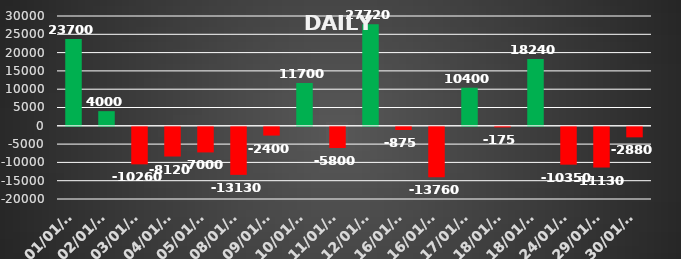
| Category | Series 0 |
|---|---|
| 2024-01-01 | 23700 |
| 2024-01-02 | 4000 |
| 2024-01-03 | -10260 |
| 2024-01-04 | -8120 |
| 2024-01-05 | -7000 |
| 2024-01-08 | -13130 |
| 2024-01-09 | -2400 |
| 2024-01-10 | 11700 |
| 2024-01-11 | -5800 |
| 2024-01-12 | 27720 |
| 2024-01-16 | -875 |
| 2024-01-16 | -13760 |
| 2024-01-17 | 10400 |
| 2024-01-18 | -175 |
| 2024-01-18 | 18240 |
| 2024-01-24 | -10350 |
| 2024-01-29 | -11130 |
| 2024-01-30 | -2880 |